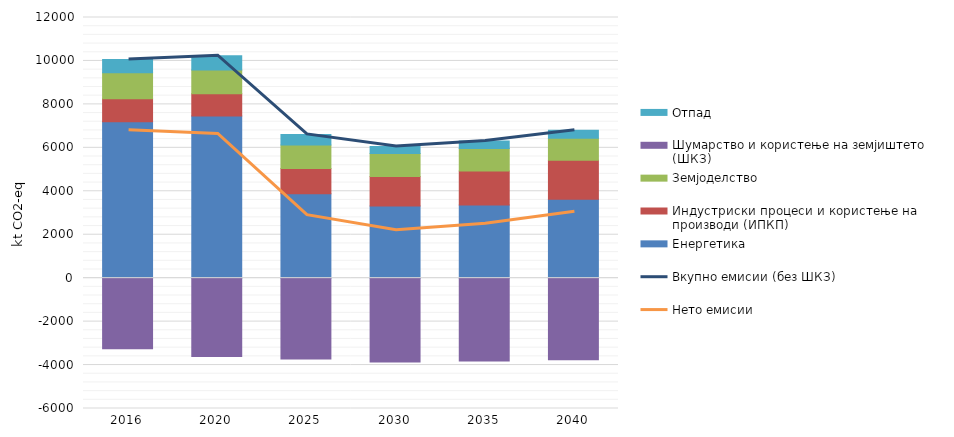
| Category | Енергетика  | Индустриски процеси и користење на производи (ИПКП) | Земјоделство | Шумарство и користење на земјиштето (ШКЗ) | Отпад |
|---|---|---|---|---|---|
| 2016.0 | 7204 | 1056 | 1191 | -3253 | 610 |
| 2020.0 | 7467 | 1024 | 1093 | -3604 | 659 |
| 2025.0 | 3887 | 1163 | 1075 | -3719 | 492 |
| 2030.0 | 3328 | 1352 | 1055 | -3855 | 323 |
| 2035.0 | 3370 | 1562 | 1036 | -3813 | 345 |
| 2040.0 | 3631 | 1792 | 1021 | -3754 | 367 |